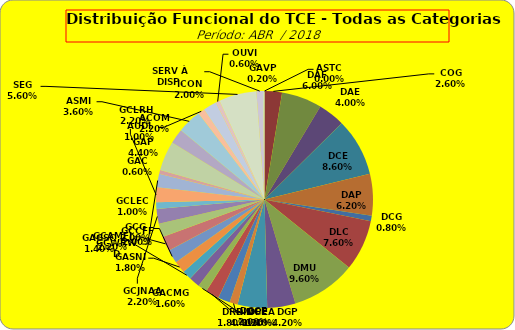
| Category | ASTC |
|---|---|
| ASTC | 0 |
| COG | 13 |
| DAF | 30 |
| DAE | 20 |
| DCE | 43 |
| DAP | 31 |
| DCG | 4 |
| DLC | 38 |
| DMU | 48 |
| DGP | 21 |
| DIN | 22 |
| DPE | 6 |
| DRR | 9 |
| DGCE | 10 |
| DGPA | 7 |
| GACMG | 8 |
| GAGSC | 7 |
| GASNI | 9 |
| GCG | 10 |
| GCAMFJ | 11 |
| GCCFF | 10 |
| GCJNAA | 11 |
| GCLEC | 5 |
| GCLRH | 11 |
| GCWRWD | 10 |
| GAC | 3 |
| GAP | 22 |
| ACOM | 11 |
| ASMI | 18 |
| AUDI | 5 |
| ICON | 10 |
| OUVI | 3 |
| SEG | 28 |
| SERV À DISP. | 5 |
| GAVP | 1 |